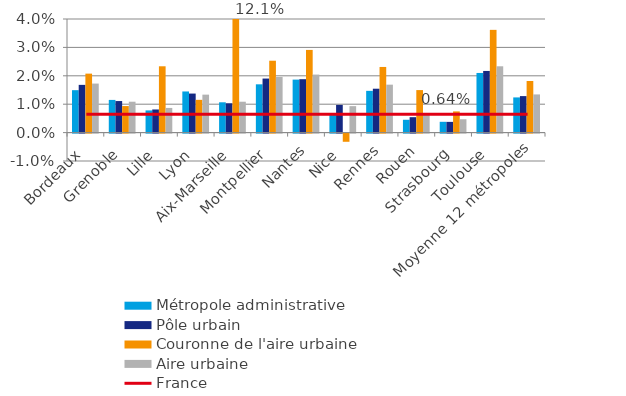
| Category | Métropole administrative | Pôle urbain | Couronne de l'aire urbaine | Aire urbaine |
|---|---|---|---|---|
| Bordeaux | 0.015 | 0.017 | 0.021 | 0.017 |
| Grenoble | 0.012 | 0.011 | 0.009 | 0.011 |
| Lille | 0.008 | 0.008 | 0.023 | 0.009 |
| Lyon | 0.014 | 0.014 | 0.012 | 0.013 |
| Aix-Marseille | 0.011 | 0.01 | 0.121 | 0.011 |
| Montpellier | 0.017 | 0.019 | 0.025 | 0.02 |
| Nantes | 0.019 | 0.019 | 0.029 | 0.02 |
| Nice | 0.007 | 0.01 | -0.003 | 0.009 |
| Rennes | 0.015 | 0.015 | 0.023 | 0.017 |
| Rouen | 0.005 | 0.005 | 0.015 | 0.006 |
| Strasbourg | 0.004 | 0.004 | 0.007 | 0.005 |
| Toulouse | 0.021 | 0.022 | 0.036 | 0.023 |
| Moyenne 12 métropoles | 0.012 | 0.013 | 0.018 | 0.013 |